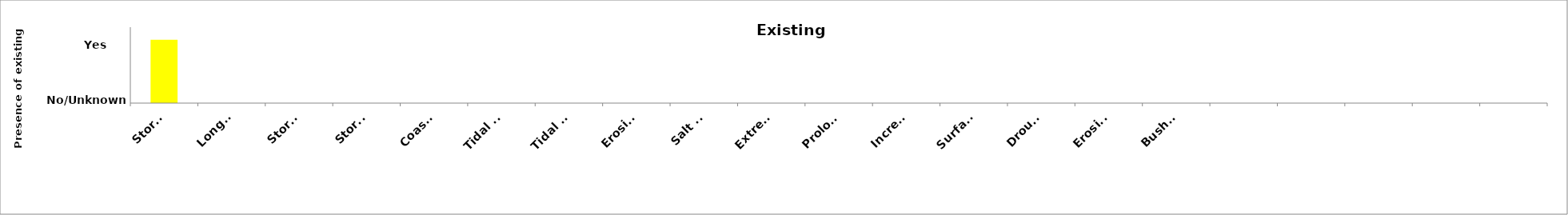
| Category | Existing risk |
|---|---|
| Storm-related beach erosion (short-term erosion) | 1 |
| Long-term shoreline recession around open coast beaches | 0 |
| Storm surge inundation of beach and surrounding areas | 0 |
| Storm surge inundation of estuaries and surrounding areas | 0 |
| Coastal lake or watercourse entrance instability | 0 |
| Tidal inundation of beach and surrounding areas | 0 |
| Tidal inundation of estuaries and surrounding area | 0 |
| Erosion within estuaries | 0 |
| Salt water intrusion to groundwater | 0 |
| Extreme winds from cyclones and coastal lows | 0 |
| Prolonged summer heatwaves | 0 |
| Increased number of hot days and nights | 0 |
| Surface water flooding (including sewer flooding) | 0 |
| Drought | 0 |
| Erosion induced by excessive rainfall | 0 |
| Bushfire | 0 |